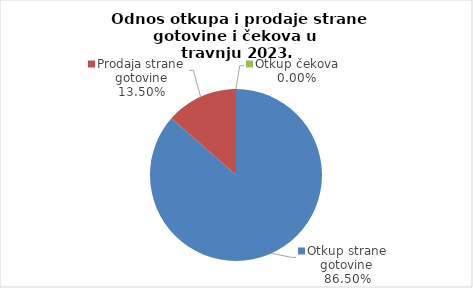
| Category | Series 0 |
|---|---|
| Otkup strane gotovine | 86.497 |
| Prodaja strane gotovine | 13.503 |
| Otkup čekova | 0 |